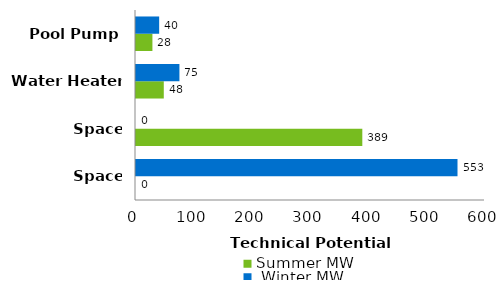
| Category | Summer MW |  Winter MW |
|---|---|---|
| Space Heating | 0 | 552.728 |
| Space Cooling | 389.081 | 0 |
| Water Heater | 47.776 | 74.657 |
| Pool Pump | 28.235 | 39.825 |